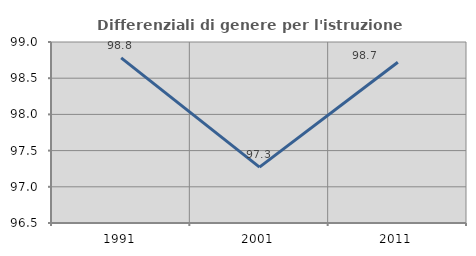
| Category | Differenziali di genere per l'istruzione superiore |
|---|---|
| 1991.0 | 98.782 |
| 2001.0 | 97.272 |
| 2011.0 | 98.72 |